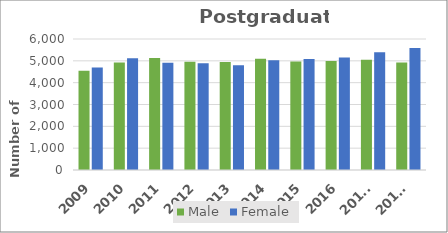
| Category | Male | Female |
|---|---|---|
| 2009 | 4542 | 4691 |
| 2010 | 4919 | 5124 |
| 2011 | 5129 | 4914 |
| 2012 | 4963 | 4890 |
| 2013 | 4951 | 4802 |
| 2014 | 5095 | 5024 |
| 2015 | 4965 | 5086 |
| 2016 | 4996 | 5158 |
| 2017* | 5046 | 5393 |
| 2018* | 4919 | 5585 |